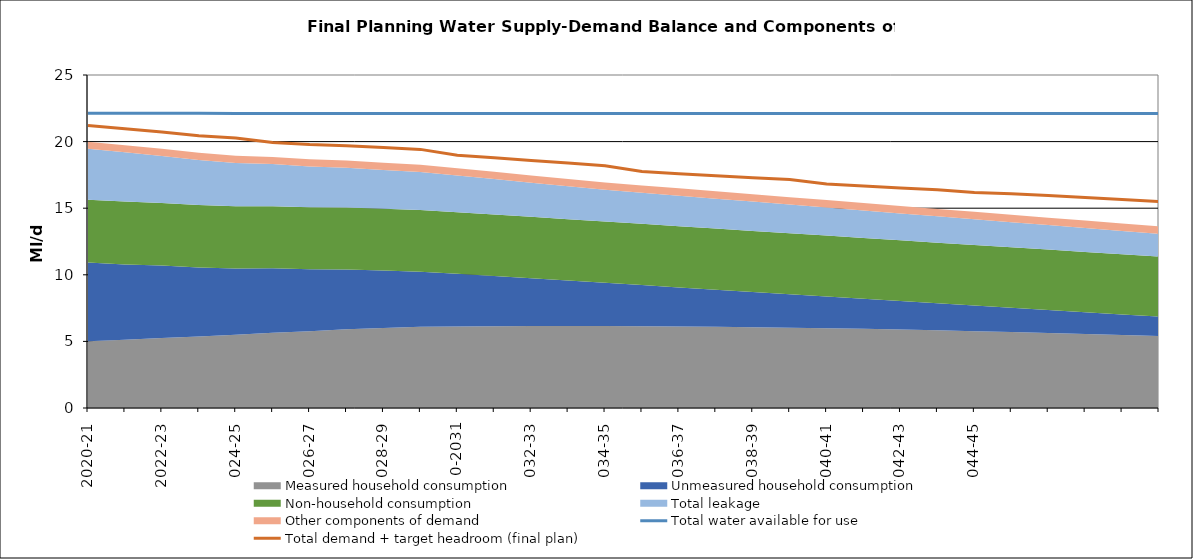
| Category | Total water available for use | Total demand + target headroom (final plan) |
|---|---|---|
| 2020-21 | 22.124 | 21.213 |
| 2021-22 | 22.123 | 20.966 |
| 2022-23 | 22.122 | 20.713 |
| 2023-24 | 22.12 | 20.441 |
| 2024-25 | 22.119 | 20.263 |
| 2025-26 | 22.118 | 19.927 |
| 2026-27 | 22.116 | 19.779 |
| 2027-28 | 22.115 | 19.693 |
| 2028-29 | 22.113 | 19.554 |
| 2029-30 | 22.112 | 19.415 |
| 2030-31 | 22.111 | 18.98 |
| 2031-32 | 22.111 | 18.788 |
| 2032-33 | 22.11 | 18.577 |
| 2033-34 | 22.11 | 18.389 |
| 2034-35 | 22.11 | 18.191 |
| 2035-36 | 22.109 | 17.753 |
| 2036-37 | 22.109 | 17.583 |
| 2037-38 | 22.108 | 17.431 |
| 2038-39 | 22.108 | 17.29 |
| 2039-40 | 22.108 | 17.149 |
| 2040-41 | 22.107 | 16.814 |
| 2041-42 | 22.107 | 16.675 |
| 2042-43 | 22.107 | 16.525 |
| 2043-44 | 22.106 | 16.385 |
| 2044-45 | 22.106 | 16.183 |
| 2045-46 | 22.106 | 16.085 |
| 2046-47 | 22.105 | 15.948 |
| 2047-48 | 22.105 | 15.802 |
| 2048-49 | 22.105 | 15.654 |
| 2049-50 | 22.104 | 15.507 |